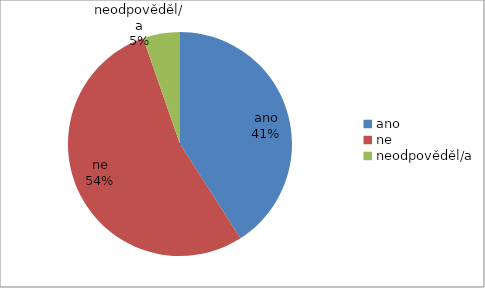
| Category | Series 0 |
|---|---|
| ano | 338 |
| ne | 444 |
| neodpověděl/a | 44 |